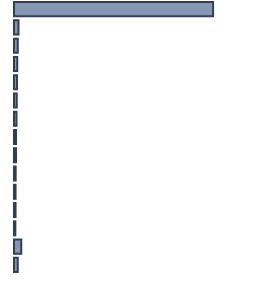
| Category | Percentatge |
|---|---|
| 0 | 82.957 |
| 1 | 1.913 |
| 2 | 1.609 |
| 3 | 1.304 |
| 4 | 1.261 |
| 5 | 1.13 |
| 6 | 1 |
| 7 | 0.826 |
| 8 | 0.826 |
| 9 | 0.696 |
| 10 | 0.652 |
| 11 | 0.652 |
| 12 | 0.565 |
| 13 | 3.043 |
| 14 | 1.565 |